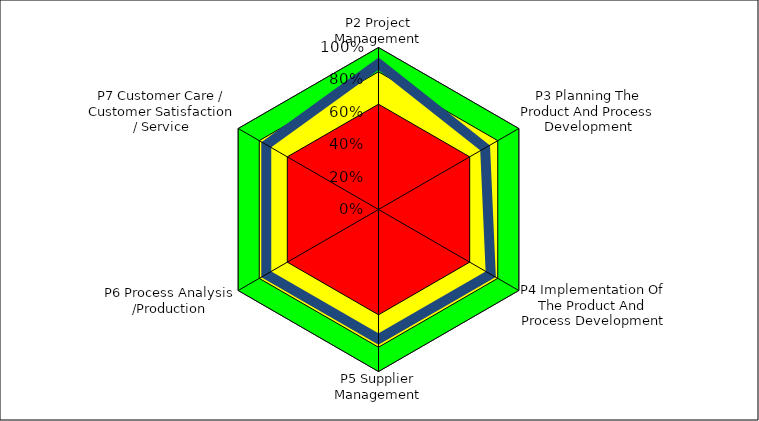
| Category | Series 0 | Series 1 | Series 2 | Series 3 |
|---|---|---|---|---|
| P2 Project Management | 1 | 0.85 | 0.65 | 0.9 |
| P3 Planning The Product And Process Development | 1 | 0.85 | 0.65 | 0.76 |
| P4 Implementation Of The Product And Process Development | 1 | 0.85 | 0.65 | 0.8 |
| P5 Supplier Management | 1 | 0.85 | 0.65 | 0.8 |
| P6 Process Analysis /Production | 1 | 0.85 | 0.65 | 0.8 |
| P7 Customer Care / Customer Satisfaction / Service | 1 | 0.85 | 0.65 | 0.8 |